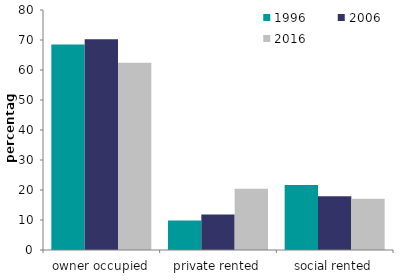
| Category | 1996 | 2006 | 2016 |
|---|---|---|---|
| owner occupied | 68.486 | 70.226 | 62.429 |
| private rented | 9.827 | 11.874 | 20.451 |
| social rented | 21.687 | 17.9 | 17.12 |